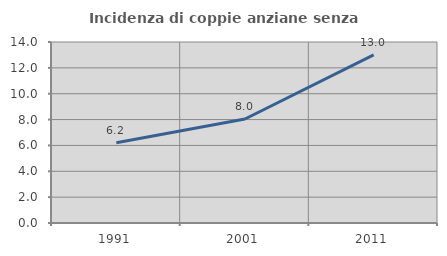
| Category | Incidenza di coppie anziane senza figli  |
|---|---|
| 1991.0 | 6.204 |
| 2001.0 | 8.042 |
| 2011.0 | 13.003 |